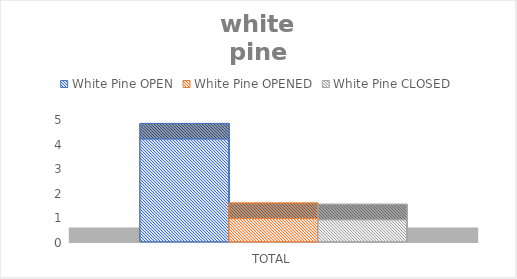
| Category | White Pine |
|---|---|
| TOTAL | 0.899 |